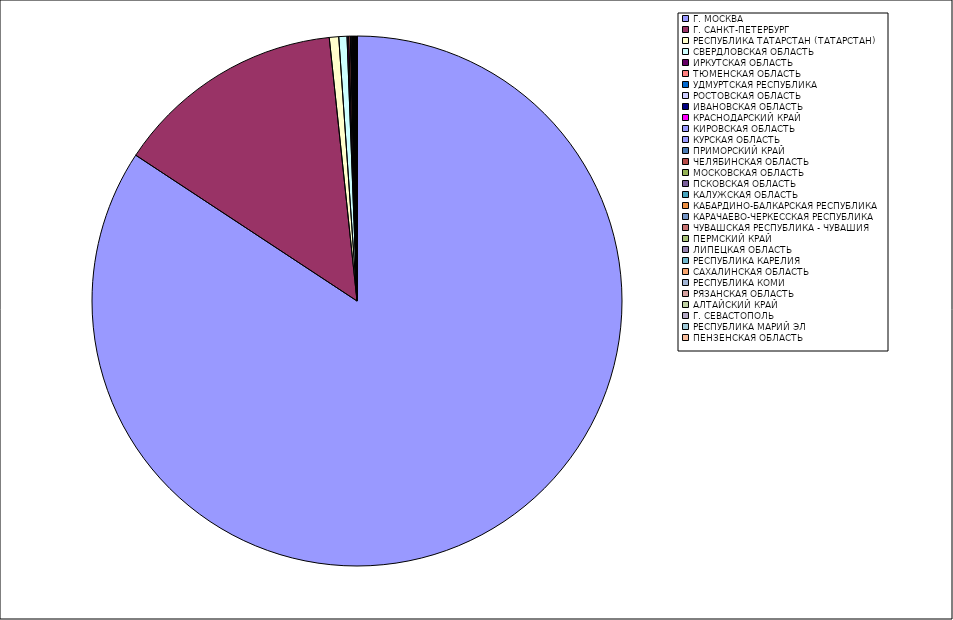
| Category | Оборот |
|---|---|
| Г. МОСКВА | 84.251 |
| Г. САНКТ-ПЕТЕРБУРГ | 14.051 |
| РЕСПУБЛИКА ТАТАРСТАН (ТАТАРСТАН) | 0.573 |
| СВЕРДЛОВСКАЯ ОБЛАСТЬ | 0.498 |
| ИРКУТСКАЯ ОБЛАСТЬ | 0.099 |
| ТЮМЕНСКАЯ ОБЛАСТЬ | 0.096 |
| УДМУРТСКАЯ РЕСПУБЛИКА | 0.05 |
| РОСТОВСКАЯ ОБЛАСТЬ | 0.05 |
| ИВАНОВСКАЯ ОБЛАСТЬ | 0.037 |
| КРАСНОДАРСКИЙ КРАЙ | 0.037 |
| КИРОВСКАЯ ОБЛАСТЬ | 0.029 |
| КУРСКАЯ ОБЛАСТЬ | 0.023 |
| ПРИМОРСКИЙ КРАЙ | 0.021 |
| ЧЕЛЯБИНСКАЯ ОБЛАСТЬ | 0.019 |
| МОСКОВСКАЯ ОБЛАСТЬ | 0.018 |
| ПСКОВСКАЯ ОБЛАСТЬ | 0.017 |
| КАЛУЖСКАЯ ОБЛАСТЬ | 0.017 |
| КАБАРДИНО-БАЛКАРСКАЯ РЕСПУБЛИКА | 0.015 |
| КАРАЧАЕВО-ЧЕРКЕССКАЯ РЕСПУБЛИКА | 0.008 |
| ЧУВАШСКАЯ РЕСПУБЛИКА - ЧУВАШИЯ | 0.008 |
| ПЕРМСКИЙ КРАЙ | 0.007 |
| ЛИПЕЦКАЯ ОБЛАСТЬ | 0.007 |
| РЕСПУБЛИКА КАРЕЛИЯ | 0.006 |
| САХАЛИНСКАЯ ОБЛАСТЬ | 0.006 |
| РЕСПУБЛИКА КОМИ | 0.006 |
| РЯЗАНСКАЯ ОБЛАСТЬ | 0.006 |
| АЛТАЙСКИЙ КРАЙ | 0.005 |
| Г. СЕВАСТОПОЛЬ | 0.005 |
| РЕСПУБЛИКА МАРИЙ ЭЛ | 0.005 |
| ПЕНЗЕНСКАЯ ОБЛАСТЬ | 0.004 |